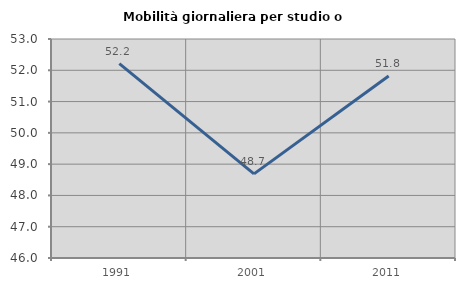
| Category | Mobilità giornaliera per studio o lavoro |
|---|---|
| 1991.0 | 52.215 |
| 2001.0 | 48.69 |
| 2011.0 | 51.818 |